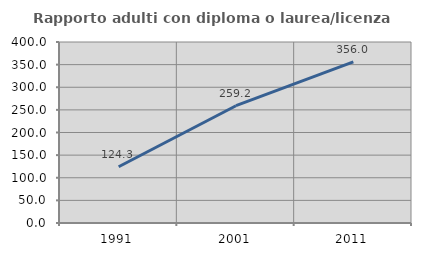
| Category | Rapporto adulti con diploma o laurea/licenza media  |
|---|---|
| 1991.0 | 124.261 |
| 2001.0 | 259.204 |
| 2011.0 | 356.009 |